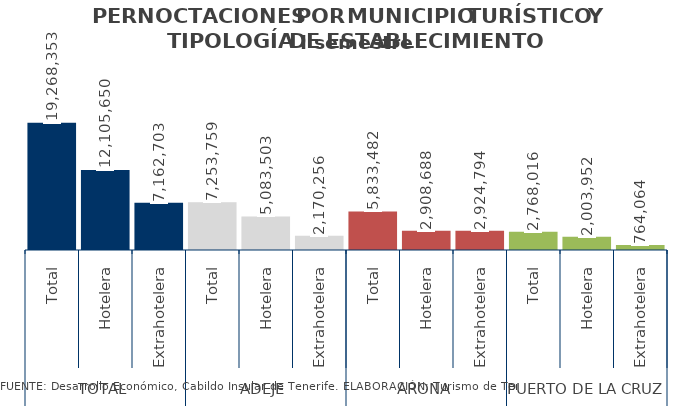
| Category | I semestre 2014 |
|---|---|
| 0 | 19268353 |
| 1 | 12105650 |
| 2 | 7162703 |
| 3 | 7253759 |
| 4 | 5083503 |
| 5 | 2170256 |
| 6 | 5833482 |
| 7 | 2908688 |
| 8 | 2924794 |
| 9 | 2768016 |
| 10 | 2003952 |
| 11 | 764064 |